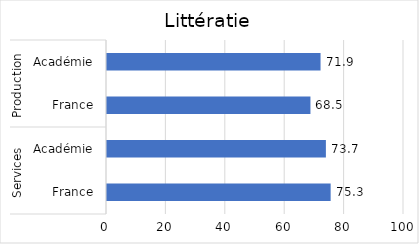
| Category | Series 0 |
|---|---|
| 0 | 75.3 |
| 1 | 73.7 |
| 2 | 68.5 |
| 3 | 71.9 |